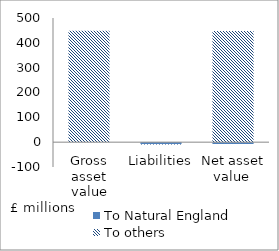
| Category | To Natural England | To others |
|---|---|---|
| Gross asset value | 0.058 | 448.977 |
| Liabilities | -7.656 | -1.538 |
| Net asset value  | -7.598 | 447.44 |